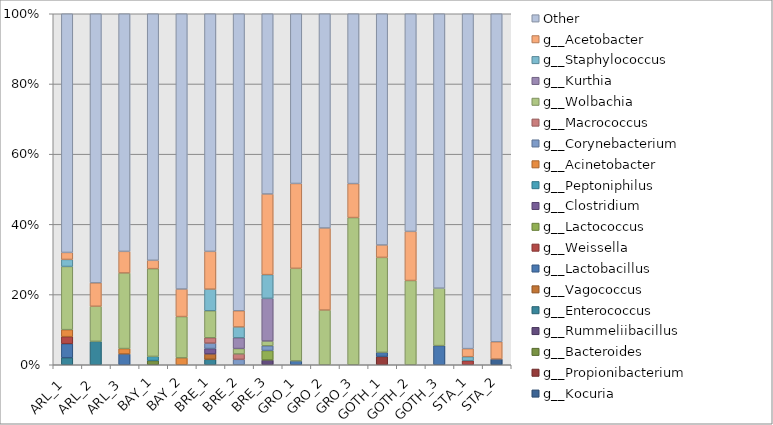
| Category | g__Kocuria | g__Propionibacterium | g__Bacteroides | g__Rummeliibacillus | g__Enterococcus | g__Vagococcus | g__Lactobacillus | g__Weissella | g__Lactococcus | g__Clostridium | g__Peptoniphilus | g__Acinetobacter | g__Corynebacterium | g__Macrococcus | g__Wolbachia | g__Kurthia | g__Staphylococcus | g__Acetobacter | Other |
|---|---|---|---|---|---|---|---|---|---|---|---|---|---|---|---|---|---|---|---|
| ARL_1 | 0 | 0 | 0 | 0 | 0.02 | 0 | 0.04 | 0.02 | 0 | 0 | 0 | 0.02 | 0 | 0 | 0.18 | 0 | 0.02 | 0.02 | 0.68 |
| ARL_2 | 0 | 0 | 0 | 0 | 0.067 | 0 | 0 | 0 | 0 | 0 | 0 | 0 | 0 | 0 | 0.1 | 0 | 0 | 0.067 | 0.767 |
| ARL_3 | 0 | 0 | 0 | 0 | 0 | 0 | 0.031 | 0 | 0 | 0 | 0 | 0.015 | 0 | 0 | 0.215 | 0 | 0 | 0.062 | 0.677 |
| BAY_1 | 0 | 0 | 0.012 | 0 | 0 | 0 | 0 | 0 | 0 | 0 | 0.012 | 0 | 0 | 0 | 0.25 | 0 | 0 | 0.024 | 0.702 |
| BAY_2 | 0 | 0 | 0 | 0 | 0 | 0 | 0 | 0 | 0 | 0 | 0 | 0.02 | 0 | 0 | 0.118 | 0 | 0 | 0.078 | 0.784 |
| BRE_1 | 0 | 0 | 0 | 0 | 0.015 | 0.015 | 0 | 0 | 0 | 0.015 | 0 | 0 | 0.015 | 0.015 | 0.077 | 0 | 0.062 | 0.108 | 0.677 |
| BRE_2 | 0 | 0 | 0 | 0 | 0 | 0 | 0 | 0 | 0 | 0 | 0 | 0 | 0.015 | 0.015 | 0.015 | 0.031 | 0.031 | 0.046 | 0.846 |
| BRE_3 | 0 | 0 | 0 | 0.014 | 0 | 0 | 0 | 0 | 0.027 | 0 | 0 | 0 | 0.014 | 0 | 0.014 | 0.122 | 0.068 | 0.23 | 0.514 |
| GRO_1 | 0 | 0 | 0 | 0 | 0 | 0 | 0.011 | 0 | 0 | 0 | 0 | 0 | 0 | 0 | 0.264 | 0 | 0 | 0.242 | 0.484 |
| GRO_2 | 0 | 0 | 0 | 0 | 0 | 0 | 0 | 0 | 0 | 0 | 0 | 0 | 0 | 0 | 0.156 | 0 | 0 | 0.234 | 0.61 |
| GRO_3 | 0 | 0 | 0 | 0 | 0 | 0 | 0 | 0 | 0 | 0 | 0 | 0 | 0 | 0 | 0.419 | 0 | 0 | 0.097 | 0.484 |
| GOTH_1 | 0 | 0.024 | 0 | 0 | 0 | 0 | 0.012 | 0 | 0 | 0 | 0 | 0 | 0 | 0 | 0.271 | 0 | 0 | 0.035 | 0.659 |
| GOTH_2 | 0 | 0 | 0 | 0 | 0 | 0 | 0 | 0 | 0 | 0 | 0 | 0 | 0 | 0 | 0.24 | 0 | 0 | 0.14 | 0.62 |
| GOTH_3 | 0 | 0 | 0 | 0 | 0 | 0 | 0.055 | 0 | 0 | 0 | 0 | 0 | 0 | 0 | 0.164 | 0 | 0 | 0 | 0.782 |
| STA_1 | 0 | 0 | 0 | 0 | 0 | 0 | 0 | 0.011 | 0 | 0 | 0 | 0 | 0 | 0 | 0 | 0 | 0.011 | 0.023 | 0.954 |
| STA_2 | 0.016 | 0 | 0 | 0 | 0 | 0 | 0 | 0 | 0 | 0 | 0 | 0 | 0 | 0 | 0 | 0 | 0 | 0.049 | 0.934 |